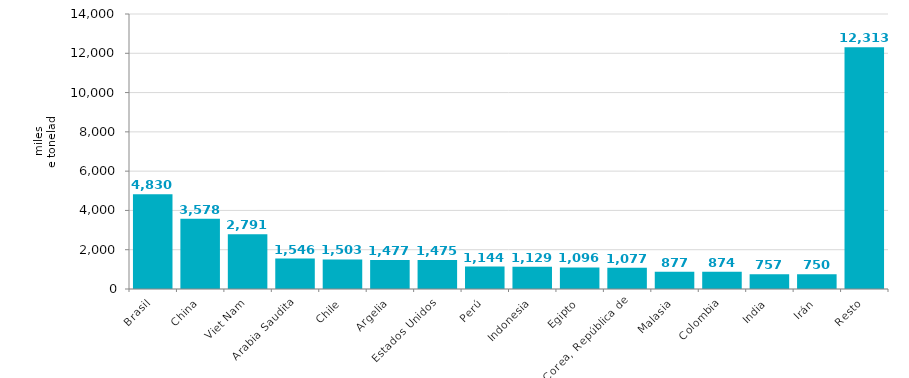
| Category | Series 0 |
|---|---|
| Brasil | 4829.56 |
| China | 3578.279 |
| Viet Nam | 2791.451 |
| Arabia Saudita | 1546.497 |
| Chile | 1503.329 |
| Argelia | 1477.043 |
| Estados Unidos | 1474.77 |
| Perú | 1144.076 |
| Indonesia | 1128.524 |
| Egipto | 1095.624 |
| Corea, República de | 1076.922 |
| Malasia | 877.391 |
| Colombia | 874.143 |
| India | 756.835 |
| Irán | 749.602 |
| Resto | 12312.557 |